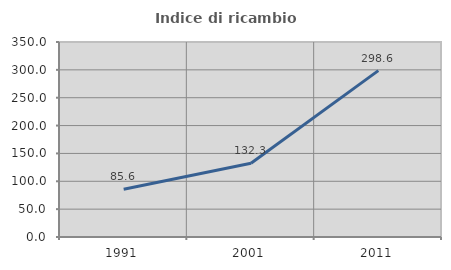
| Category | Indice di ricambio occupazionale  |
|---|---|
| 1991.0 | 85.645 |
| 2001.0 | 132.27 |
| 2011.0 | 298.647 |